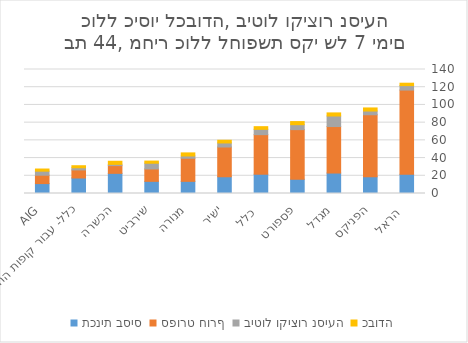
| Category | תכנית בסיס | ספורט חורף | ביטול וקיצור נסיעה | כבודה |
|---|---|---|---|---|
| הראל  | 21.7 | 95.06 | 5.04 | 2.73 |
| הפניקס | 18.9 | 70 | 4.2 | 3.5 |
| מגדל | 23.1 | 52.5 | 11.9 | 3.5 |
| פספורט | 16.1 | 56 | 5.6 | 3.5 |
| כלל  | 21.77 | 44.66 | 6.02 | 3.01 |
| ישיר | 18.9 | 33.6 | 4.55 | 3.08 |
| מנורה | 13.72 | 26.04 | 2.59 | 3.5 |
| שירביט | 13.72 | 14 | 6.44 | 2.45 |
| הכשרה | 22.75 | 8.75 | 1.4 | 3.5 |
| כלל- עבור קופות החולים | 17.5 | 9.1 | 2.45 | 2.31 |
| AIG | 11.2 | 9.45 | 4.55 | 2.45 |